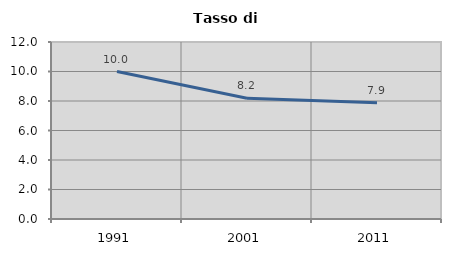
| Category | Tasso di disoccupazione   |
|---|---|
| 1991.0 | 10 |
| 2001.0 | 8.191 |
| 2011.0 | 7.888 |